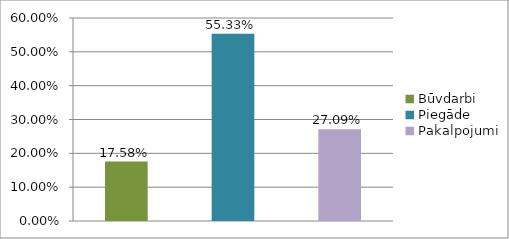
| Category | Series 0 |
|---|---|
| Būvdarbi | 0.176 |
| Piegāde | 0.553 |
| Pakalpojumi | 0.271 |